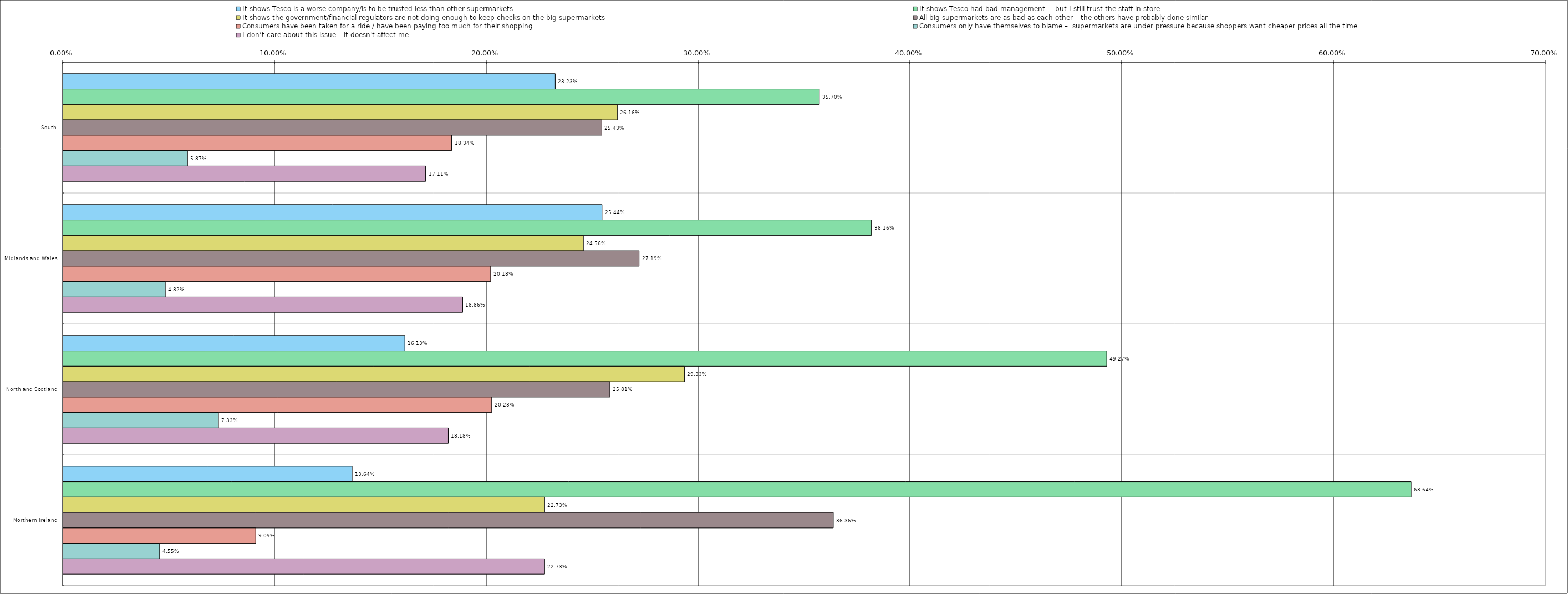
| Category | It shows Tesco is a worse company/is to be trusted less than other supermarkets | It shows Tesco had bad management –  but I still trust the staff in store | It shows the government/financial regulators are not doing enough to keep checks on the big supermarkets | All big supermarkets are as bad as each other – the others have probably done similar | Consumers have been taken for a ride / have been paying too much for their shopping | Consumers only have themselves to blame –  supermarkets are under pressure because shoppers want cheaper prices all the time | I don’t care about this issue – it doesn't affect me |
|---|---|---|---|---|---|---|---|
| 0 | 0.232 | 0.357 | 0.262 | 0.254 | 0.183 | 0.059 | 0.171 |
| 1 | 0.254 | 0.382 | 0.246 | 0.272 | 0.202 | 0.048 | 0.189 |
| 2 | 0.161 | 0.493 | 0.293 | 0.258 | 0.202 | 0.073 | 0.182 |
| 3 | 0.136 | 0.636 | 0.227 | 0.364 | 0.091 | 0.046 | 0.227 |